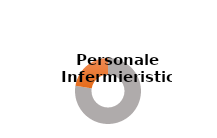
| Category | Series 0 |
|---|---|
| Donne  | 0.775 |
| Uomini  | 0.225 |